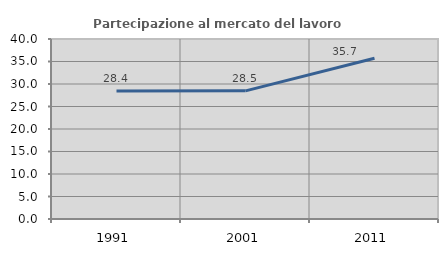
| Category | Partecipazione al mercato del lavoro  femminile |
|---|---|
| 1991.0 | 28.443 |
| 2001.0 | 28.475 |
| 2011.0 | 35.714 |